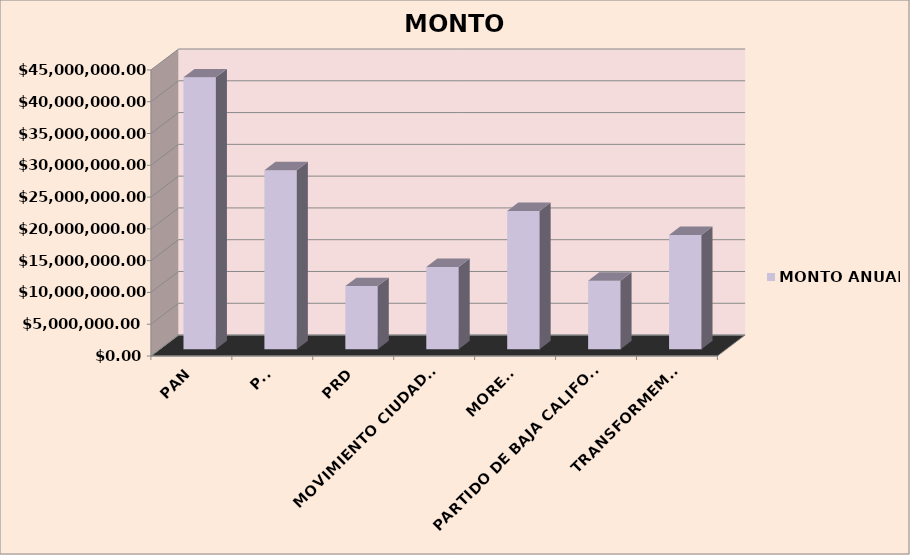
| Category | MONTO ANUAL |
|---|---|
| PAN | 42769044.53 |
| PRI | 28152850.8 |
| PRD | 9938378.61 |
| MOVIMIENTO CIUDADANO | 12943710.75 |
| MORENA | 21750755.69 |
| PARTIDO DE BAJA CALIFORNIA | 10785487.28 |
| TRANSFORMEMOS  | 17976095.4 |